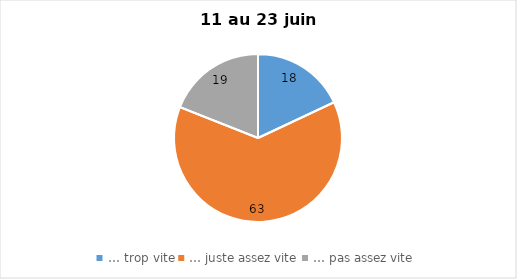
| Category | Series 0 |
|---|---|
| … trop vite | 18 |
| … juste assez vite | 63 |
| … pas assez vite | 19 |